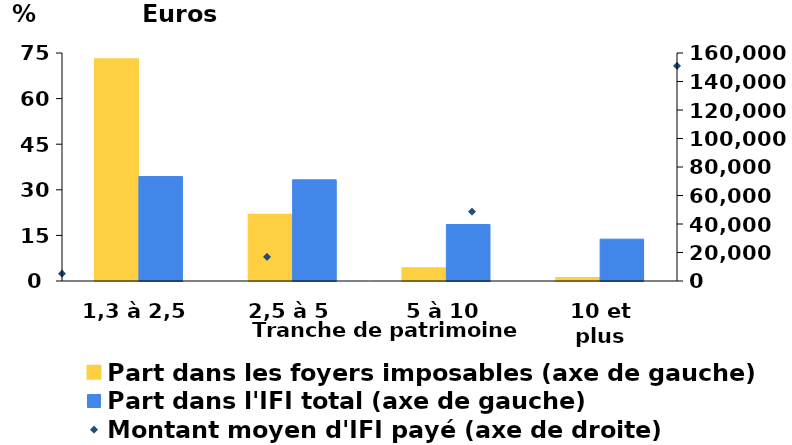
| Category | Part dans les foyers imposables (axe de gauche) | Part dans l'IFI total (axe de gauche) |
|---|---|---|
| 1,3 à 2,5 | 72.96 | 34.355 |
| 2,5 à 5 | 21.806 | 33.29 |
| 5 à 10 | 4.224 | 18.582 |
| 10 et plus | 1.01 | 13.772 |